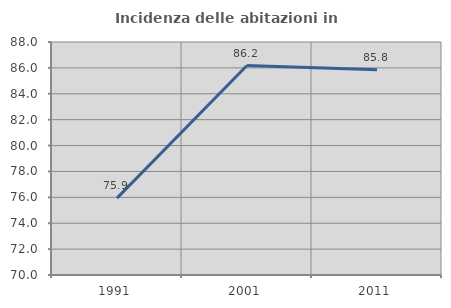
| Category | Incidenza delle abitazioni in proprietà  |
|---|---|
| 1991.0 | 75.94 |
| 2001.0 | 86.179 |
| 2011.0 | 85.849 |